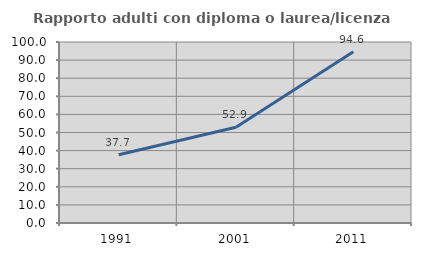
| Category | Rapporto adulti con diploma o laurea/licenza media  |
|---|---|
| 1991.0 | 37.688 |
| 2001.0 | 52.881 |
| 2011.0 | 94.615 |